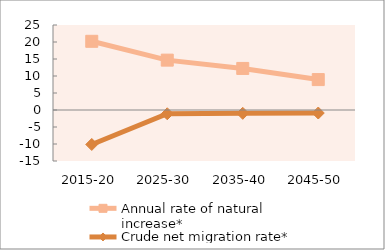
| Category | Annual rate of natural increase* | Crude net migration rate* |
|---|---|---|
| 2015-20 | 20.206 | -10.142 |
| 2025-30 | 14.668 | -1.105 |
| 2035-40 | 12.221 | -0.977 |
| 2045-50 | 8.946 | -0.886 |